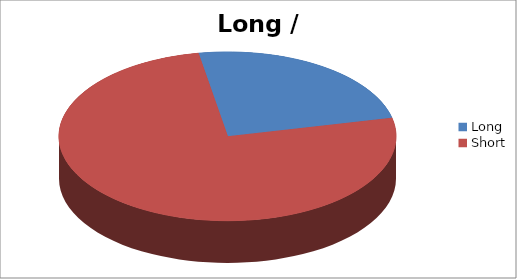
| Category | Series 1 |
|---|---|
| Long | 31 |
| Short | 97 |